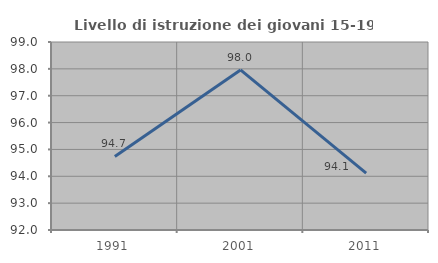
| Category | Livello di istruzione dei giovani 15-19 anni |
|---|---|
| 1991.0 | 94.737 |
| 2001.0 | 97.959 |
| 2011.0 | 94.118 |